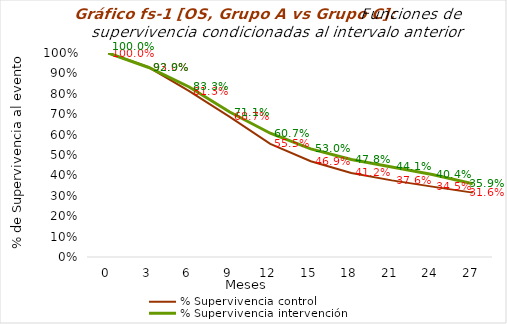
| Category | % Supervivencia control | % Supervivencia intervención |
|---|---|---|
| 0.0 | 1 | 1 |
| 3.0 | 0.93 | 0.929 |
| 6.0 | 0.813 | 0.833 |
| 9.0 | 0.687 | 0.711 |
| 12.0 | 0.555 | 0.607 |
| 15.0 | 0.469 | 0.53 |
| 18.0 | 0.412 | 0.478 |
| 21.0 | 0.376 | 0.441 |
| 24.0 | 0.345 | 0.404 |
| 27.0 | 0.316 | 0.359 |